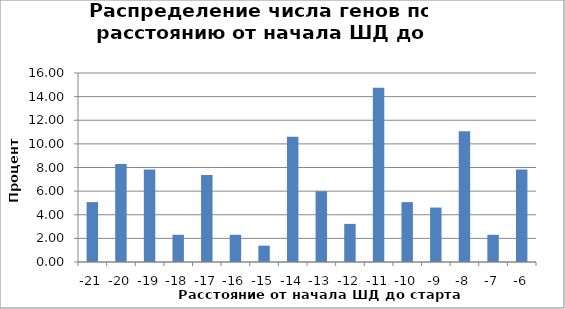
| Category | Процент генов |
|---|---|
| -21.0 | 5.069 |
| -20.0 | 8.295 |
| -19.0 | 7.834 |
| -18.0 | 2.304 |
| -17.0 | 7.373 |
| -16.0 | 2.304 |
| -15.0 | 1.382 |
| -14.0 | 10.599 |
| -13.0 | 5.991 |
| -12.0 | 3.226 |
| -11.0 | 14.747 |
| -10.0 | 5.069 |
| -9.0 | 4.608 |
| -8.0 | 11.06 |
| -7.0 | 2.304 |
| -6.0 | 7.834 |